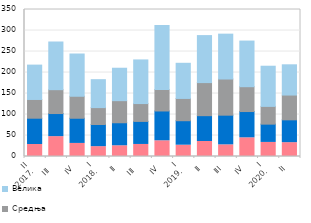
| Category | Микропредузећа | Мала | Средња | Велика |
|---|---|---|---|---|
| II
2017. | 28.601 | 62.573 | 44.608 | 81.806 |
| III  | 47.306 | 54.987 | 56.8 | 113.518 |
| IV | 31.129 | 59.946 | 52.372 | 100.581 |
| I
2018. | 23.458 | 52.774 | 40.183 | 66.517 |
| II | 25.544 | 54.802 | 52.603 | 77.229 |
| III  | 28.673 | 54.873 | 42.484 | 103.899 |
| IV | 37.41 | 70.984 | 51.038 | 152.215 |
| I
2019. | 26.913 | 58.293 | 53.033 | 83.702 |
| II | 35.763 | 61.475 | 78.723 | 111.897 |
| III | 27.759 | 70.634 | 86.103 | 106.825 |
| IV | 44.489 | 62.561 | 59.132 | 108.665 |
| I
2020. | 33.497 | 43.549 | 42.255 | 95.672 |
| II | 32.96 | 54.335 | 59 | 72.028 |